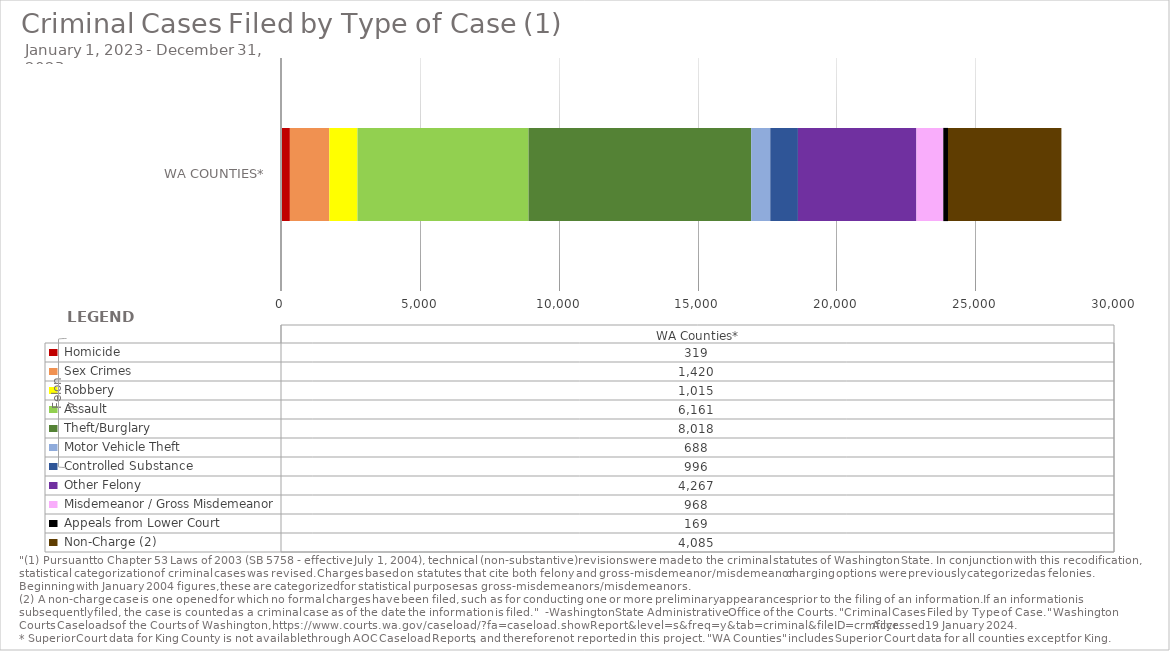
| Category |  Homicide  |  Sex Crimes  |  Robbery  |  Assault  |  Theft/Burglary  |  Motor Vehicle Theft  |  Controlled Substance  |  Other Felony  |  Misdemeanor / Gross Misdemeanor  |  Appeals from Lower Court  |  Non-Charge (2)  |
|---|---|---|---|---|---|---|---|---|---|---|---|
|  WA Counties* | 319 | 1420 | 1015 | 6161 | 8018 | 688 | 996 | 4267 | 968 | 169 | 4085 |